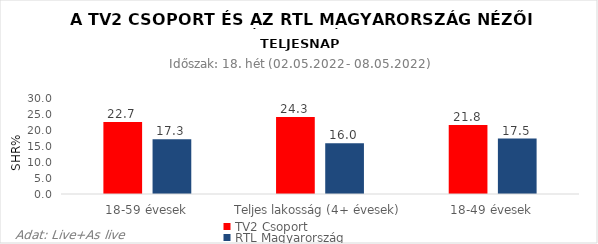
| Category | TV2 Csoport | RTL Magyarország |
|---|---|---|
| 18-59 évesek | 22.7 | 17.3 |
| Teljes lakosság (4+ évesek) | 24.3 | 16 |
| 18-49 évesek | 21.8 | 17.5 |